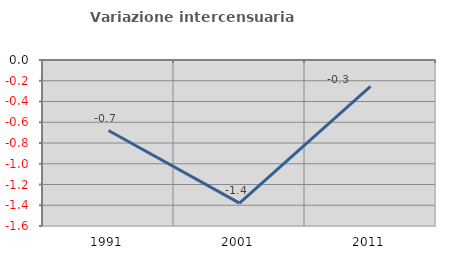
| Category | Variazione intercensuaria annua |
|---|---|
| 1991.0 | -0.68 |
| 2001.0 | -1.379 |
| 2011.0 | -0.254 |